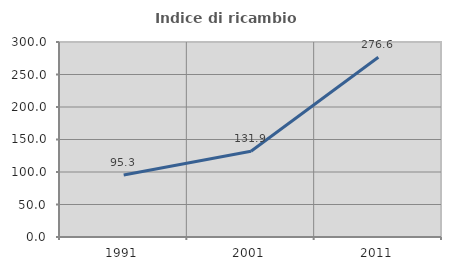
| Category | Indice di ricambio occupazionale  |
|---|---|
| 1991.0 | 95.333 |
| 2001.0 | 131.897 |
| 2011.0 | 276.623 |